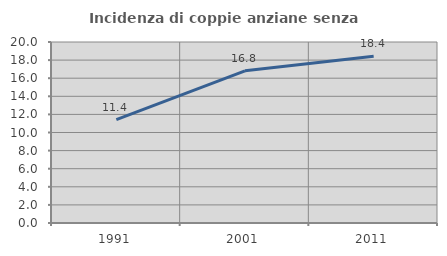
| Category | Incidenza di coppie anziane senza figli  |
|---|---|
| 1991.0 | 11.429 |
| 2001.0 | 16.817 |
| 2011.0 | 18.421 |